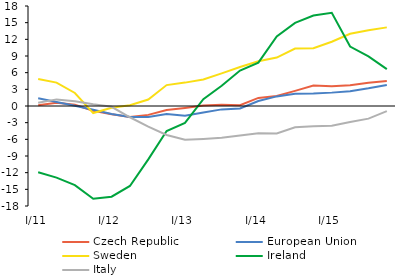
| Category | Czech Republic | European Union | Sweden | Ireland | Italy |
|---|---|---|---|---|---|
| I/11 | 0.12 | 1.395 | 4.86 | -11.924 | 0.583 |
| II | 0.569 | 0.719 | 4.216 | -12.892 | 1.19 |
| III | 0.23 | 0.03 | 2.344 | -14.251 | 0.867 |
| IV | -0.86 | -0.668 | -1.272 | -16.689 | 0.319 |
| I/12 | -1.488 | -1.435 | -0.321 | -16.327 | -0.14 |
| II | -1.976 | -1.973 | 0.145 | -14.391 | -2.026 |
| III | -1.598 | -1.996 | 1.174 | -9.61 | -3.725 |
| IV | -0.716 | -1.426 | 3.765 | -4.496 | -5.223 |
| I/13 | -0.345 | -1.769 | 4.21 | -3.033 | -6.084 |
| II | 0.091 | -1.163 | 4.784 | 1.222 | -5.931 |
| III | 0.234 | -0.608 | 5.87 | 3.648 | -5.717 |
| IV | 0.152 | -0.438 | 7.018 | 6.382 | -5.312 |
| I/14 | 1.455 | 0.896 | 8.042 | 7.8 | -4.891 |
| II | 1.801 | 1.73 | 8.716 | 12.502 | -4.932 |
| III | 2.725 | 2.202 | 10.346 | 14.951 | -3.843 |
| IV | 3.704 | 2.241 | 10.403 | 16.288 | -3.647 |
| I/15 | 3.539 | 2.408 | 11.564 | 16.787 | -3.551 |
| II | 3.738 | 2.676 | 13.006 | 10.704 | -2.865 |
| III | 4.2 | 3.181 | 13.654 | 8.923 | -2.276 |
| IV | 4.511 | 3.773 | 14.151 | 6.628 | -0.92 |